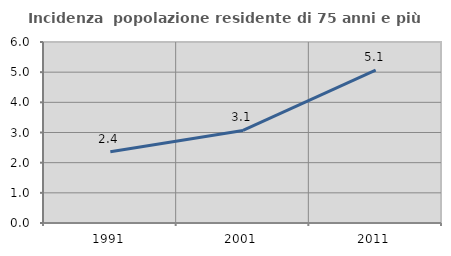
| Category | Incidenza  popolazione residente di 75 anni e più |
|---|---|
| 1991.0 | 2.364 |
| 2001.0 | 3.068 |
| 2011.0 | 5.068 |